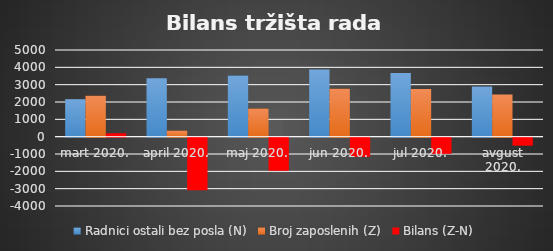
| Category | Radnici ostali bez posla (N) | Broj zaposlenih (Z) | Bilans (Z-N) |
|---|---|---|---|
| mart 2020. | 2162 | 2359 | 197 |
| april 2020. | 3375 | 348 | -3027 |
| maj 2020. | 3528 | 1619 | -1909 |
| jun 2020. | 3879 | 2770 | -1109 |
| jul 2020. | 3677 | 2745 | -932 |
| avgust 2020. | 2897 | 2434 | -463 |